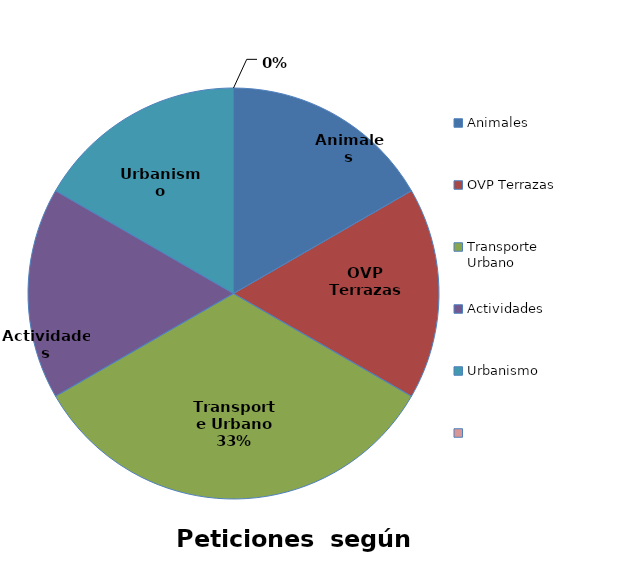
| Category | Series 0 |
|---|---|
| Animales | 0.167 |
| OVP Terrazas | 0.167 |
| Transporte Urbano | 0.333 |
| Actividades | 0.167 |
| Urbanismo | 0.167 |